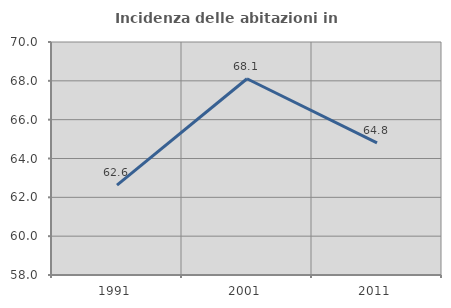
| Category | Incidenza delle abitazioni in proprietà  |
|---|---|
| 1991.0 | 62.628 |
| 2001.0 | 68.107 |
| 2011.0 | 64.809 |